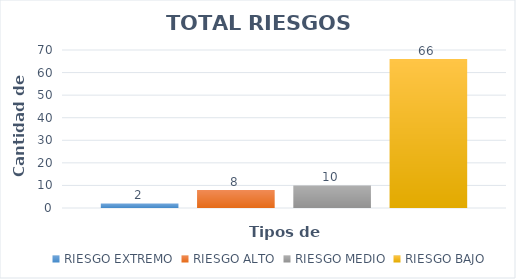
| Category | RIESGO EXTREMO | RIESGO ALTO | RIESGO MEDIO | RIESGO BAJO |
|---|---|---|---|---|
| 0 | 2 | 8 | 10 | 66 |